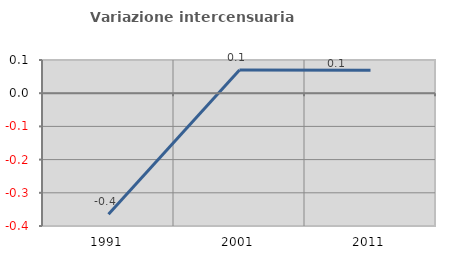
| Category | Variazione intercensuaria annua |
|---|---|
| 1991.0 | -0.365 |
| 2001.0 | 0.07 |
| 2011.0 | 0.069 |